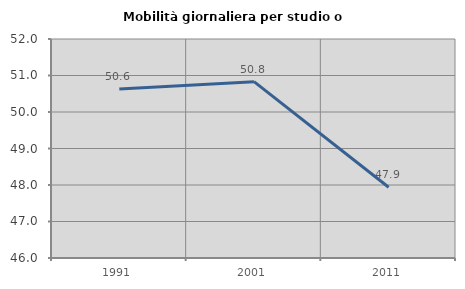
| Category | Mobilità giornaliera per studio o lavoro |
|---|---|
| 1991.0 | 50.63 |
| 2001.0 | 50.832 |
| 2011.0 | 47.94 |